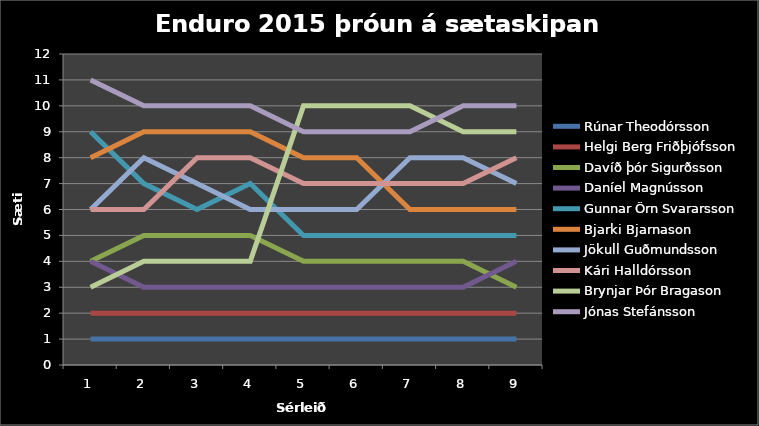
| Category | Rúnar Theodórsson | Helgi Berg Friðþjófsson | Davíð þór Sigurðsson | Daníel Magnússon | Gunnar Örn Svararsson | Bjarki Bjarnason | Jökull Guðmundsson | Kári Halldórsson | Brynjar Þór Bragason | Jónas Stefánsson |
|---|---|---|---|---|---|---|---|---|---|---|
| 0 | 1 | 2 | 4 | 4 | 9 | 8 | 6 | 6 | 3 | 11 |
| 1 | 1 | 2 | 5 | 3 | 7 | 9 | 8 | 6 | 4 | 10 |
| 2 | 1 | 2 | 5 | 3 | 6 | 9 | 7 | 8 | 4 | 10 |
| 3 | 1 | 2 | 5 | 3 | 7 | 9 | 6 | 8 | 4 | 10 |
| 4 | 1 | 2 | 4 | 3 | 5 | 8 | 6 | 7 | 10 | 9 |
| 5 | 1 | 2 | 4 | 3 | 5 | 8 | 6 | 7 | 10 | 9 |
| 6 | 1 | 2 | 4 | 3 | 5 | 6 | 8 | 7 | 10 | 9 |
| 7 | 1 | 2 | 4 | 3 | 5 | 6 | 8 | 7 | 9 | 10 |
| 8 | 1 | 2 | 3 | 4 | 5 | 6 | 7 | 8 | 9 | 10 |